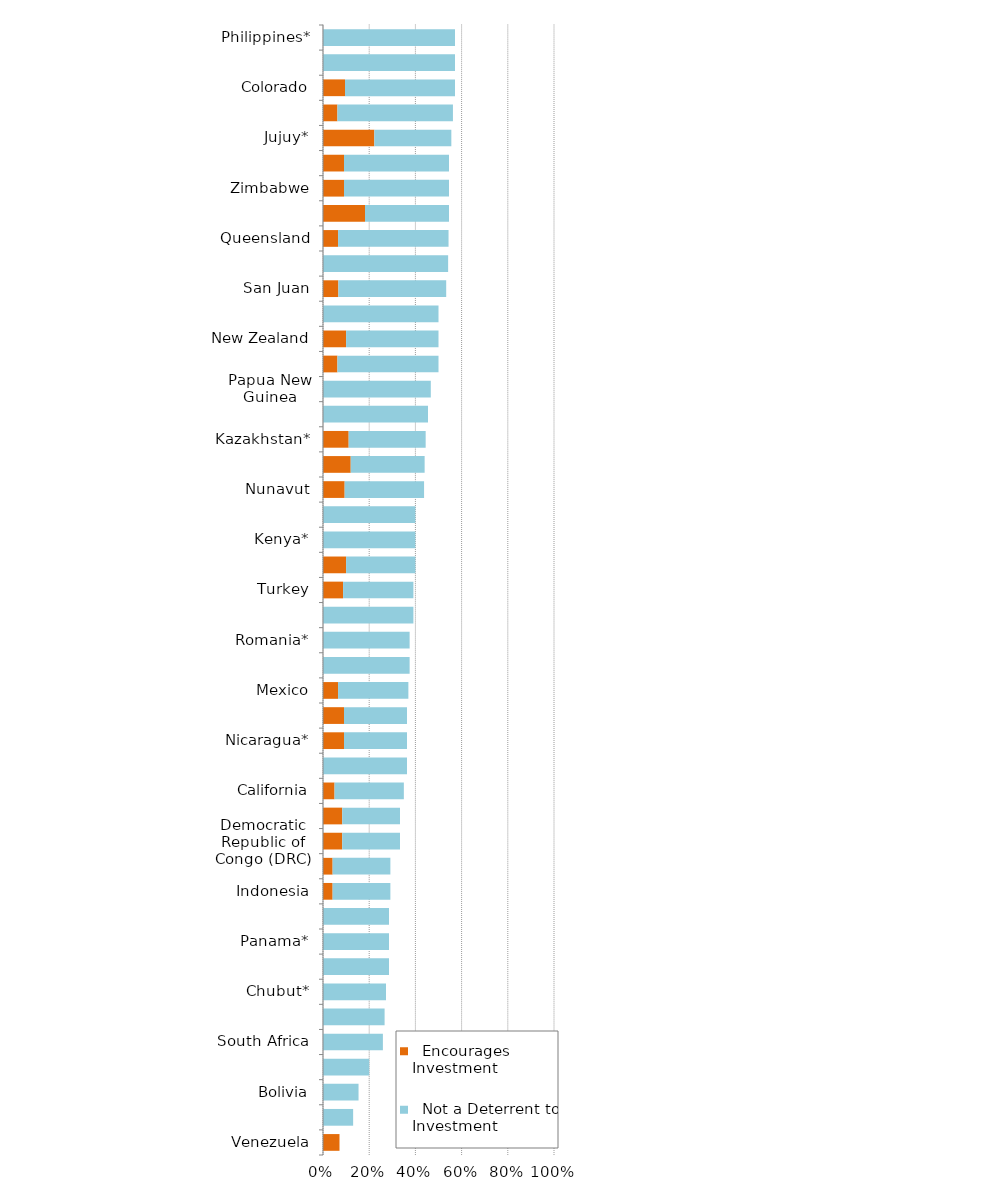
| Category |   Encourages Investment |   Not a Deterrent to Investment |
|---|---|---|
| Venezuela | 0.071 | 0 |
| Ecuador | 0 | 0.13 |
| Bolivia | 0 | 0.154 |
| Guatemala | 0 | 0.2 |
| South Africa | 0 | 0.259 |
| Zambia | 0 | 0.267 |
| Chubut* | 0 | 0.273 |
| La Rioja* | 0 | 0.286 |
| Panama* | 0 | 0.286 |
| Suriname* | 0 | 0.286 |
| Indonesia | 0.042 | 0.25 |
| Tanzania | 0.042 | 0.25 |
| Democratic Republic of Congo (DRC) | 0.083 | 0.25 |
| Brazil | 0.083 | 0.25 |
| California | 0.05 | 0.3 |
| Mendoza | 0 | 0.364 |
| Nicaragua* | 0.091 | 0.273 |
| Mongolia* | 0.091 | 0.273 |
| Mexico | 0.065 | 0.304 |
| China* | 0 | 0.375 |
| Romania* | 0 | 0.375 |
| Colombia | 0 | 0.391 |
| Turkey | 0.087 | 0.304 |
| Ivory Coast* | 0.1 | 0.3 |
| Kenya* | 0 | 0.4 |
| French Guiana | 0 | 0.4 |
| Nunavut | 0.094 | 0.344 |
| Greenland | 0.12 | 0.32 |
| Kazakhstan* | 0.111 | 0.333 |
| Ghana | 0 | 0.455 |
| Papua New Guinea | 0 | 0.467 |
| Washington | 0.062 | 0.438 |
| New Zealand | 0.1 | 0.4 |
| Santa Cruz | 0 | 0.5 |
| San Juan | 0.067 | 0.467 |
| Victoria | 0 | 0.542 |
| Queensland | 0.065 | 0.478 |
| Minnesota* | 0.182 | 0.364 |
| Zimbabwe | 0.091 | 0.455 |
| Russia* | 0.091 | 0.455 |
| Jujuy* | 0.222 | 0.333 |
| Mali | 0.062 | 0.5 |
| Colorado | 0.095 | 0.476 |
| Montana | 0 | 0.571 |
| Philippines* | 0 | 0.571 |